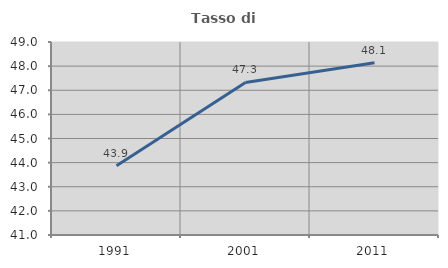
| Category | Tasso di occupazione   |
|---|---|
| 1991.0 | 43.866 |
| 2001.0 | 47.324 |
| 2011.0 | 48.138 |